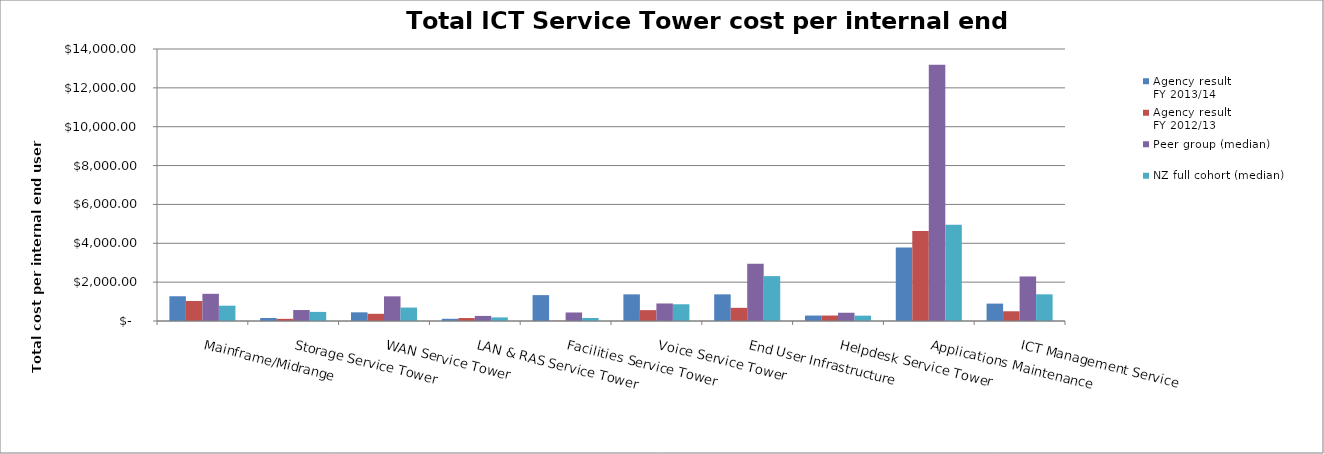
| Category | Agency result
FY 2013/14 | Agency result
FY 2012/13 | Peer group (median) | NZ full cohort (median) |
|---|---|---|---|---|
| Mainframe/Midrange | 1273.824 | 1029.966 | 1399.35 | 787.407 |
| Storage Service Tower | 154.806 | 111.73 | 564.691 | 468.275 |
| WAN Service Tower | 446.941 | 371.147 | 1269.036 | 691.603 |
| LAN & RAS Service Tower | 113.608 | 152.397 | 262.37 | 184.52 |
| Facilities Service Tower | 1332.085 | 9.418 | 438.407 | 153.125 |
| Voice Service Tower | 1371.619 | 558.647 | 902.006 | 861.764 |
| End User Infrastructure | 1371.619 | 678.51 | 2951.754 | 2310.534 |
| Helpdesk Service Tower | 280.067 | 280.822 | 425.274 | 275.846 |
| Applications Maintenance | 3784.02 | 4634.418 | 13184.91 | 4958.49 |
| ICT Management Service | 895.547 | 500.856 | 2292.896 | 1372.868 |